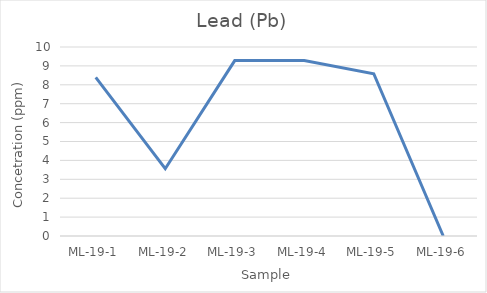
| Category | Lead |
|---|---|
| ML-19-1 | 8.394 |
| ML-19-2 | 3.56 |
| ML-19-3 | 9.28 |
| ML-19-4 | 9.289 |
| ML-19-5 | 8.584 |
| ML-19-6 | 0 |